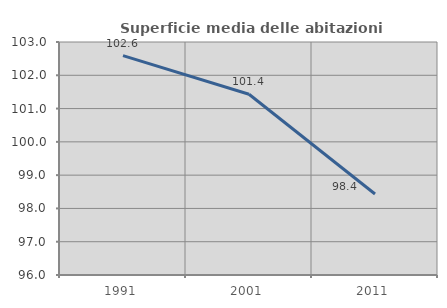
| Category | Superficie media delle abitazioni occupate |
|---|---|
| 1991.0 | 102.592 |
| 2001.0 | 101.432 |
| 2011.0 | 98.432 |